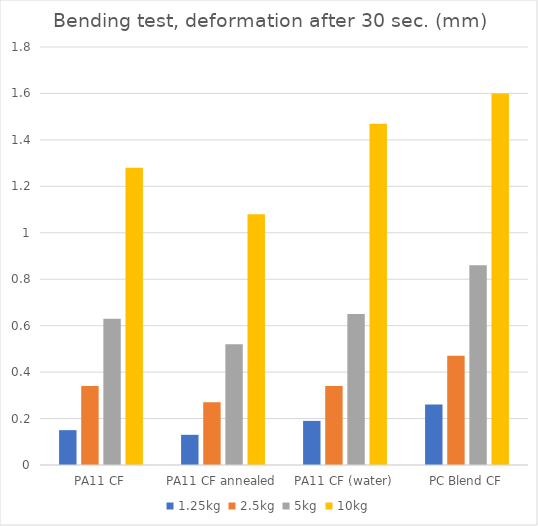
| Category | 1.25kg | 2.5kg | 5kg | 10kg |
|---|---|---|---|---|
| PA11 CF | 0.15 | 0.34 | 0.63 | 1.28 |
| PA11 CF annealed | 0.13 | 0.27 | 0.52 | 1.08 |
| PA11 CF (water) | 0.19 | 0.34 | 0.65 | 1.47 |
| PC Blend CF | 0.26 | 0.47 | 0.86 | 1.6 |